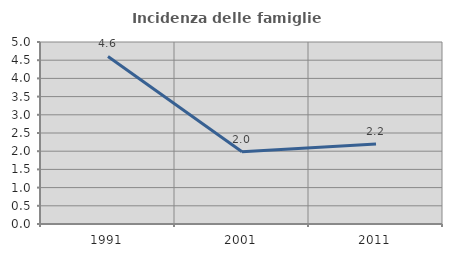
| Category | Incidenza delle famiglie numerose |
|---|---|
| 1991.0 | 4.603 |
| 2001.0 | 1.988 |
| 2011.0 | 2.2 |